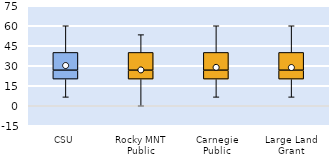
| Category | 25th | 50th | 75th |
|---|---|---|---|
| CSU | 20 | 6.667 | 13.333 |
| Rocky MNT Public | 20 | 6.667 | 13.333 |
| Carnegie Public | 20 | 6.667 | 13.333 |
| Large Land Grant | 20 | 6.667 | 13.333 |